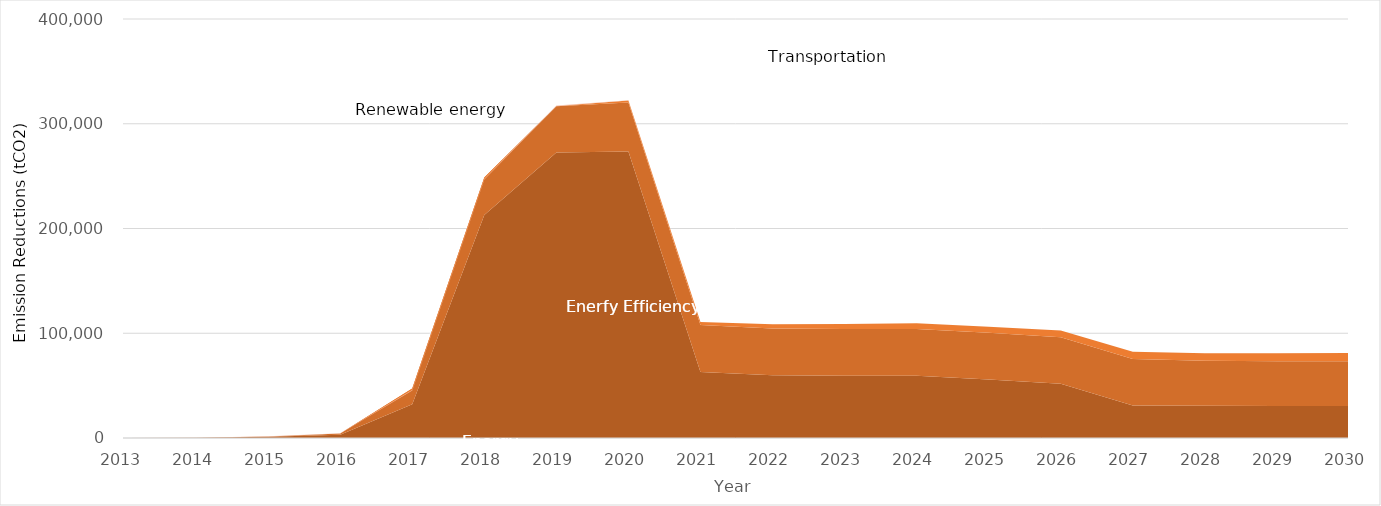
| Category | Energy efficiency | Renewable energy | Waste management & biomass utilisation | Transportation |
|---|---|---|---|---|
| 0 | 0 | 0 | 0 | 0 |
| 1 | 127 | 36 | 0 | 0 |
| 2 | 1239 | 259 | 0 | 134 |
| 3 | 3122 | 1158 | 0 | 324 |
| 4 | 32181 | 15180 | -1933 | 324 |
| 5 | 212864 | 35822 | -1853 | 324 |
| 6 | 272485 | 44250 | 262 | 324 |
| 7 | 273506 | 46858 | 1833 | 324 |
| 8 | 63008 | 44756 | 3030 | 0 |
| 9 | 59892 | 44753 | 3970 | 0 |
| 10 | 59318 | 44750 | 4728 | 0 |
| 11 | 59335 | 44747 | 5359 | 0 |
| 12 | 55772 | 44620 | 5897 | 0 |
| 13 | 51679 | 44516 | 6367 | 0 |
| 14 | 31108 | 44333 | 6785 | 0 |
| 15 | 30866 | 42956 | 7163 | 0 |
| 16 | 30431 | 42858 | 7509 | 0 |
| 17 | 30525 | 42858 | 7829 | 0 |